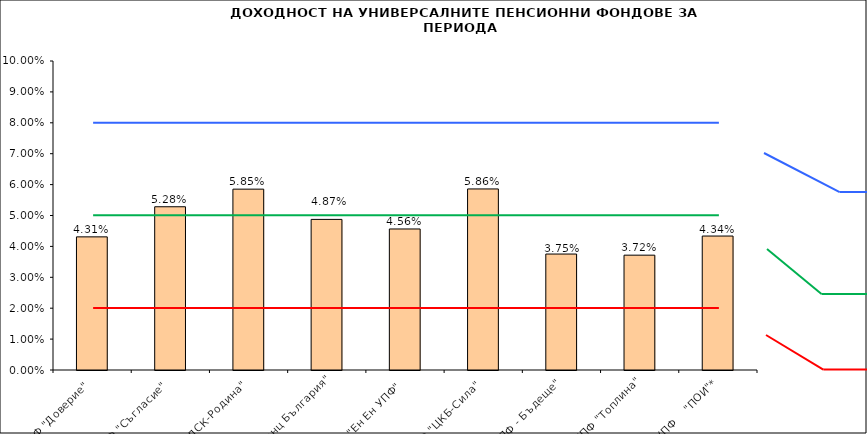
| Category | Series 0 |
|---|---|
| УПФ "Доверие"  | 0.043 |
| УПФ "Съгласие"  | 0.053 |
| УПФ "ДСК-Родина"  | 0.059 |
| "ЗУПФ Алианц България" | 0.049 |
| "Eн Ен УПФ"  | 0.046 |
| УПФ "ЦКБ-Сила"  | 0.059 |
| "УПФ - Бъдеще" | 0.038 |
| УПФ "Топлина" | 0.037 |
| УПФ    "ПОИ"* | 0.043 |